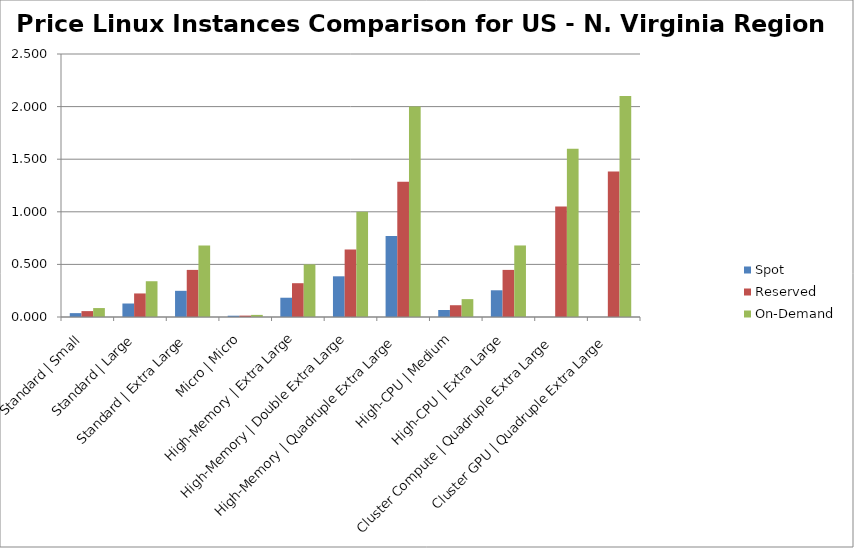
| Category | Spot | Reserved | On-Demand |
|---|---|---|---|
| Standard | Small | 0.037 | 0.056 | 0.085 |
| Standard | Large | 0.128 | 0.224 | 0.34 |
| Standard | Extra Large | 0.249 | 0.448 | 0.68 |
| Micro | Micro | 0.012 | 0.013 | 0.02 |
| High-Memory | Extra Large | 0.183 | 0.321 | 0.5 |
| High-Memory | Double Extra Large | 0.387 | 0.643 | 1 |
| High-Memory | Quadruple Extra Large | 0.77 | 1.285 | 2 |
| High-CPU | Medium | 0.067 | 0.112 | 0.17 |
| High-CPU | Extra Large | 0.254 | 0.448 | 0.68 |
| Cluster Compute | Quadruple Extra Large | 0 | 1.05 | 1.6 |
| Cluster GPU | Quadruple Extra Large | 0 | 1.383 | 2.1 |